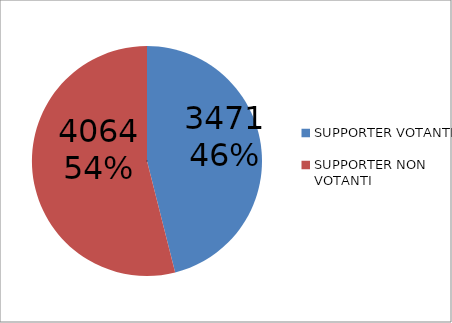
| Category | Series 0 |
|---|---|
| SUPPORTER VOTANTI | 3471 |
| SUPPORTER NON VOTANTI | 4064 |